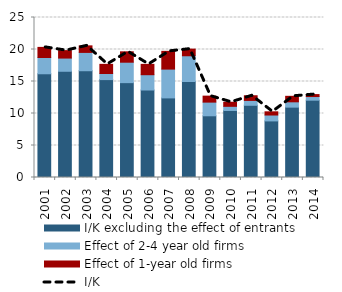
| Category | I/K excluding the effect of entrants | Effect of 2-4 year old firms | Effect of 1-year old firms |
|---|---|---|---|
| 2001.0 | 16.209 | 2.541 | 1.579 |
| 2002.0 | 16.599 | 2.062 | 1.164 |
| 2003.0 | 16.682 | 2.863 | 1.024 |
| 2004.0 | 15.297 | 0.953 | 1.428 |
| 2005.0 | 14.821 | 3.194 | 1.623 |
| 2006.0 | 13.67 | 2.391 | 1.615 |
| 2007.0 | 12.436 | 4.502 | 2.773 |
| 2008.0 | 15 | 4.021 | 1.038 |
| 2009.0 | 9.643 | 2.135 | 0.935 |
| 2010.0 | 10.475 | 0.646 | 0.637 |
| 2011.0 | 11.284 | 0.759 | 0.73 |
| 2012.0 | 8.842 | 0.92 | 0.501 |
| 2013.0 | 10.994 | 0.831 | 0.859 |
| 2014.0 | 12.081 | 0.568 | 0.307 |